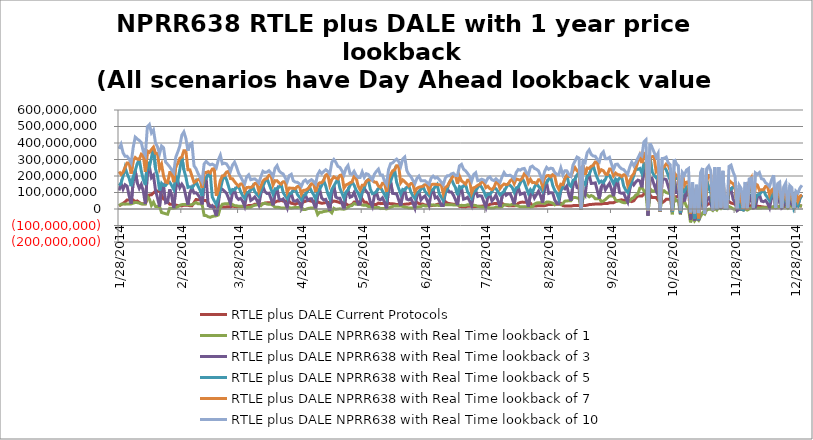
| Category | RTLE plus DALE Current Protocols | RTLE plus DALE NPRR638 with Real Time lookback of 1 | RTLE plus DALE NPRR638 with Real Time lookback of 3 | RTLE plus DALE NPRR638 with Real Time lookback of 5 | RTLE plus DALE NPRR638 with Real Time lookback of 7 | RTLE plus DALE NPRR638 with Real Time lookback of 10 |
|---|---|---|---|---|---|---|
| 1/28/14 | 18516424.113 | 20399560.426 | 112095958.616 | 142272377.272 | 226830423.44 | 364435115.637 |
| 1/29/14 | 26165652.225 | 28909144.799 | 155416252.293 | 155416252.293 | 209776525.425 | 391856557.637 |
| 1/30/14 | 33951592.112 | 30255629.968 | 120211298.967 | 198749863.235 | 223461243.791 | 340827630.768 |
| 1/31/14 | 43045783.01 | 29263774.278 | 146816658.791 | 251543005.81 | 251543005.81 | 319220078.994 |
| 2/1/14 | 54769080.035 | 30826459.922 | 138255348.886 | 213737360.818 | 279364302.681 | 319215565.212 |
| 2/2/14 | 54769080.035 | 30827968.441 | 79570255.275 | 185868729.61 | 279365654.399 | 302592761.632 |
| 2/3/14 | 54769080.035 | 30884832.851 | 30884832.851 | 138313696.677 | 213795577.059 | 279422518.809 |
| 2/4/14 | 54867904.896 | 35517006.21 | 165214299.553 | 193458300.274 | 292853142.244 | 373257685.61 |
| 2/5/14 | 44459964.79 | 39470498.834 | 232678368.051 | 232678368.051 | 312012565.709 | 435789966.993 |
| 2/6/14 | 48889341.468 | 38610057.335 | 157680296.919 | 275745232.644 | 302300052.615 | 424138458.213 |
| 2/7/14 | 39654347.796 | 35788167.659 | 124989301.759 | 300301529.113 | 300301529.113 | 415849050.923 |
| 2/8/14 | 32006154.249 | 31525750.605 | 148644249.645 | 229967872.296 | 332348260.04 | 402675690.205 |
| 2/9/14 | 32006154.249 | 30052473.463 | 108138911.42 | 177240204.925 | 325256826.954 | 347786114.363 |
| 2/10/14 | 32006154.249 | 30010066.314 | 30010066.314 | 144966008.475 | 224766518.477 | 325214419.805 |
| 2/11/14 | 63028979.82 | 76700764.711 | 221611411.153 | 283824705.48 | 351335542.64 | 498756808.259 |
| 2/12/14 | 85547610.904 | 60494095.955 | 255828584.745 | 255828584.745 | 342984214.06 | 512044208.671 |
| 2/13/14 | 85937272.747 | 22122072.307 | 190198002.969 | 310790969.787 | 360198263.116 | 461362233.501 |
| 2/14/14 | 97417042.342 | 41624599.795 | 205096050.102 | 375213213.897 | 375213213.897 | 478931855.04 |
| 2/15/14 | 109654336.546 | 15554018.819 | 113405379.327 | 244220459.746 | 337402647.488 | 400890888.955 |
| 2/16/14 | 109654336.546 | 15730046.644 | 67330196.654 | 200732422.143 | 336290164.841 | 375788939.316 |
| 2/17/14 | 109654336.546 | 15216624.189 | 15216624.189 | 112325077.424 | 242372737.804 | 334970201.166 |
| 2/18/14 | 84640835.996 | -21566277.736 | 126275726.066 | 156043260.111 | 270950090.733 | 381962236.98 |
| 2/19/14 | 60344140.354 | -24846953.971 | 142855503.401 | 142855503.401 | 199006510.714 | 370793735.507 |
| 2/20/14 | 56842811.04 | -28865713.315 | 36959656.061 | 142748386.433 | 163544165.408 | 284226804.264 |
| 2/21/14 | 42485541.507 | -31619771.792 | 40687866.115 | 159591848.004 | 159591848.004 | 270980460.73 |
| 2/22/14 | 29104966.55 | 5285201.83 | 119182273.325 | 162749827.4 | 220503997.894 | 255561639.115 |
| 2/23/14 | 29104966.55 | 5258478.618 | 78625305.436 | 141818140.221 | 220479769.18 | 236659790.027 |
| 2/24/14 | 29104966.55 | 5194667.969 | 5194667.969 | 119093465.364 | 162661798.283 | 220415958.53 |
| 2/25/14 | 23864162.506 | 7421725.703 | 124712521.729 | 195262193.233 | 255087814.132 | 313775878.883 |
| 2/26/14 | 21068769.319 | 14281252.442 | 169088114.263 | 169088114.263 | 276490635.937 | 345878901.198 |
| 2/27/14 | 19355877.946 | 22426579.864 | 129003166.061 | 238706821.862 | 307830720.012 | 382579019.585 |
| 2/28/14 | 18802534.063 | 26546401.694 | 150344897.786 | 314663844.16 | 314663844.16 | 447190654.783 |
| 3/1/14 | 23128178.094 | 27570564.314 | 130953776.934 | 238202969.225 | 353648650.807 | 467047318.339 |
| 3/2/14 | 23128178.094 | 27353331.227 | 76942359.745 | 194020500.728 | 353630624.907 | 427426977.336 |
| 3/3/14 | 23128178.094 | 27360286.777 | 27360286.777 | 130813057.374 | 238142993.436 | 353643048.647 |
| 3/4/14 | 19411967.958 | 24752961.765 | 99163431.365 | 134862197.291 | 237319805.025 | 390451392.11 |
| 3/5/14 | 19581333.766 | 27296179.854 | 128518329.272 | 128518329.272 | 198679959.438 | 399800107.88 |
| 3/6/14 | 38369816.469 | 32655651.702 | 97150487.572 | 145070150.244 | 161080137.956 | 261946828.014 |
| 3/7/14 | 57550185.653 | 38998330.31 | 98349647.378 | 169079986.621 | 169079986.621 | 244859808.595 |
| 3/8/14 | 56044264.844 | 31311869.251 | 85143202.348 | 137302429.27 | 178083187.714 | 214849075.524 |
| 3/9/14 | 56044264.844 | 31375785.518 | 67019980.06 | 114031028.373 | 178147103.981 | 191204769.557 |
| 3/10/14 | 56044264.844 | 28194421.17 | 28194421.17 | 78546573.934 | 127730186.353 | 165727343.42 |
| 3/11/14 | 50786282.858 | -38603299.401 | 161688003.813 | 185925226.319 | 220749716.952 | 272978841.364 |
| 3/12/14 | 52394012.107 | -40010102.679 | 186641318.346 | 186641318.346 | 220630272.35 | 288581287.711 |
| 3/13/14 | 35279158.185 | -47059323.929 | 21210291.885 | 205157444.541 | 227046638.859 | 275386190.136 |
| 3/14/14 | 16658128.226 | -50496691.407 | 14727990.447 | 218556217.602 | 218556217.602 | 267628556.027 |
| 3/15/14 | 13706829.115 | -45236902.647 | 20976756.156 | 73790873.645 | 241989220.377 | 272033096.495 |
| 3/16/14 | 13706829.115 | -42858848.14 | -6181524.118 | 49634938.153 | 244791957.035 | 264870208.648 |
| 3/17/14 | 13706829.115 | -41377827.735 | -41377827.735 | 26038787.558 | 79763387.511 | 249591177.904 |
| 3/18/14 | 10367868.111 | -36083955.279 | 35209461.609 | 64469423.371 | 117292990.368 | 297452494.831 |
| 3/19/14 | 12220663.599 | 8814215.317 | 117139973.304 | 117139973.304 | 172788227.596 | 326073164.546 |
| 3/20/14 | 12280244.26 | 28825247.756 | 119464012.825 | 173236216.827 | 200805949.153 | 273577515.356 |
| 3/21/14 | 11383137.771 | 31178675.474 | 107715120.013 | 202707793.599 | 202707793.599 | 277844514.912 |
| 3/22/14 | 12942133.313 | 31486913.965 | 96613368.867 | 179788811.91 | 223435346.748 | 273582224.148 |
| 3/23/14 | 12942133.313 | 32931142.76 | 66617748.202 | 139058570.437 | 228386477.183 | 254831529.613 |
| 3/24/14 | 12942133.313 | 33297882.275 | 33297882.275 | 99577972.252 | 184176012.424 | 228753216.697 |
| 3/25/14 | 17287550.961 | 27019098.062 | 95187188.243 | 118358544.928 | 183386141.979 | 265885819.02 |
| 3/26/14 | 15207576.706 | 20731678.708 | 115715879.684 | 115715879.684 | 165798670.533 | 284138168.476 |
| 3/27/14 | 14204179.027 | 19466712.249 | 71756989.156 | 129768908.284 | 150624727.153 | 255002716.449 |
| 3/28/14 | 14449424.791 | 16762579.613 | 57904940.344 | 138241155.836 | 138241155.836 | 217217098.022 |
| 3/29/14 | 14431130.416 | 16928720.949 | 64542354.672 | 105065633.362 | 151983405.088 | 195574983.95 |
| 3/30/14 | 14431130.416 | 16375521.769 | 47476738.718 | 81082644.195 | 152608404.611 | 171862245.587 |
| 3/31/14 | 14431130.416 | 16393714.844 | 16393714.844 | 64390708.987 | 105185906.574 | 152626597.685 |
| 4/1/14 | 16995874.674 | 8229864.943 | 82331726.994 | 100593736.579 | 130048387.746 | 195210144.549 |
| 4/2/14 | 21725595.053 | 10901868.095 | 101014651.712 | 101014651.712 | 131623164.16 | 207502321.668 |
| 4/3/14 | 21760578.006 | 11257107.549 | 51796726.877 | 113219309.046 | 129947290.716 | 177538614.623 |
| 4/4/14 | 22200325.638 | 18815747.692 | 60178249.301 | 137457699.171 | 137457699.171 | 180753472.529 |
| 4/5/14 | 29239053.06 | 22883433.973 | 72798411.964 | 105050869.508 | 154639293.517 | 182760642.38 |
| 4/6/14 | 29239053.06 | 25167714.016 | 53752331.659 | 89827944.234 | 157100012.723 | 172740884.09 |
| 4/7/14 | 29239053.06 | 25399282.136 | 25399282.136 | 75425715.648 | 107753933.416 | 157450844.792 |
| 4/8/14 | 29183939.861 | 19811145.351 | 91828139.239 | 108285570.381 | 138269581.289 | 195740538.599 |
| 4/9/14 | 31253222.94 | 32896921.708 | 136772876.22 | 136772876.22 | 168502134.247 | 228804522.067 |
| 4/10/14 | 35731584.745 | 35326201.861 | 105443668.028 | 166309223.849 | 180918523.99 | 221246226.888 |
| 4/11/14 | 37383103.331 | 30326233.599 | 94130749.536 | 184622068.255 | 184622068.255 | 223954387.321 |
| 4/12/14 | 37762809.86 | 28200141.994 | 95834528.567 | 153042469.156 | 204640179.139 | 232212116.41 |
| 4/13/14 | 37762809.86 | 28120921.581 | 63158200.938 | 120475550.292 | 204560958.726 | 218245683.366 |
| 4/14/14 | 37762809.86 | 22197135.174 | 22197135.174 | 88887305.055 | 145354111.202 | 196286973.059 |
| 4/15/14 | 41320322.684 | 11109363.49 | 97184440.963 | 122558726.982 | 171894155.131 | 246804504.802 |
| 4/16/14 | 47764436.788 | 10825030.574 | 121046076.019 | 121046076.019 | 171365297.371 | 263246726.911 |
| 4/17/14 | 48480241.035 | 9469986.987 | 60943235.906 | 134281648.027 | 157780871.472 | 230910895.517 |
| 4/18/14 | 52261334.29 | 6376184.691 | 54784455.271 | 150351906.019 | 150351906.019 | 218566336.945 |
| 4/19/14 | 48076803.709 | 5960283.339 | 61138720.413 | 100167288.581 | 165018617.697 | 212537661.948 |
| 4/20/14 | 48076803.709 | 6902649.97 | 37297593.058 | 79977385.927 | 165960984.328 | 188858167.563 |
| 4/21/14 | 48076803.709 | 6999524.424 | 6999524.424 | 61882944.852 | 100656529.819 | 165009417.859 |
| 4/22/14 | 45342148.746 | 8385112.379 | 76913099.898 | 93440557.477 | 126705019.651 | 202527682.467 |
| 4/23/14 | 34456654.042 | 5301228.127 | 95112883.903 | 95112883.903 | 126366379.156 | 210461630.553 |
| 4/24/14 | 32702431.172 | 7988943.516 | 51168346.394 | 111168051.871 | 125677551.303 | 171057533.711 |
| 4/25/14 | 28520085.338 | 9118878.286 | 47086018.441 | 122588273.714 | 122588273.714 | 163175599.845 |
| 4/26/14 | 34704659.752 | 9736707.172 | 54411694.63 | 88348960.78 | 135988876.635 | 161954110.021 |
| 4/27/14 | 34704659.752 | 10085582.312 | 38112515.19 | 72039422.747 | 138870940.296 | 152727137.593 |
| 4/28/14 | 34704659.752 | 9611379.932 | 9611379.932 | 55142927.77 | 89730374.782 | 138159830.194 |
| 4/29/14 | 42270405.843 | -3575001.005 | 66396867.509 | 83274868.768 | 112956121.273 | 167207113.784 |
| 4/30/14 | 46844133.068 | -3126888.078 | 85771411.802 | 85771411.802 | 114117763.621 | 175974898.246 |
| 5/1/14 | 52461928.948 | 1886900.822 | 52894469.086 | 107890372.609 | 121146385.618 | 158721396.757 |
| 5/2/14 | 50123324.586 | 4970372.35 | 61047782.043 | 134187386.191 | 134187386.191 | 170523286.842 |
| 5/3/14 | 47294111.154 | 6236129.945 | 62451658.149 | 106936173.391 | 153526711.881 | 177750504.327 |
| 5/4/14 | 47294111.154 | 6238334.367 | 36407069.787 | 87652493.008 | 153528916.303 | 165841535.847 |
| 5/5/14 | 47294111.154 | 3122166.131 | 3122166.131 | 59952712.002 | 104863470.158 | 151854179.215 |
| 5/6/14 | 43241075.89 | -33550119.086 | 80585785.265 | 102496528.93 | 148641107.49 | 208652458.318 |
| 5/7/14 | 38024569.058 | -19284536.777 | 119967008.343 | 119967008.343 | 158962532.991 | 229287834.598 |
| 5/8/14 | 34800096.191 | -19935900.169 | 66262534.982 | 142589189.357 | 159727436.196 | 214178044.31 |
| 5/9/14 | 36025740.274 | -14875699.018 | 55126161.574 | 173959395.969 | 173959395.969 | 226769027.812 |
| 5/10/14 | 39347436.698 | -13832699.011 | 58375378.204 | 139253877.613 | 205505130.441 | 238028451.104 |
| 5/11/14 | 39347436.698 | -10894130.644 | 27128898.462 | 94516582.061 | 212093355.575 | 228355596.662 |
| 5/12/14 | 39347436.698 | -10831841.643 | -10831841.643 | 62594914.09 | 145087030.109 | 212155644.577 |
| 5/13/14 | 41773531.356 | -23387488.304 | 89302477.486 | 118676610.101 | 178280341.129 | 282787260.09 |
| 5/14/14 | 48505784.744 | 4296506.785 | 139069331.83 | 139069331.83 | 194430574.218 | 300041034.514 |
| 5/15/14 | 45934095.2 | -2514503.899 | 72263137.216 | 161260383.33 | 187310522.435 | 282858358.157 |
| 5/16/14 | 43115859.464 | -50985.301 | 64823188.72 | 182478193.243 | 182478193.243 | 258174266.499 |
| 5/17/14 | 37879502.938 | 1174317.403 | 65477551.259 | 125242559.457 | 203739130.916 | 252086265.839 |
| 5/18/14 | 37879502.938 | -358004.218 | 34737466.246 | 95834541.139 | 207069561.111 | 231535290.214 |
| 5/19/14 | 37879502.938 | -1359306.428 | -1359306.428 | 64822459.99 | 126226434.758 | 207064445.456 |
| 5/20/14 | 31479478.931 | 2375964.158 | 83080581.082 | 103389962.769 | 146090453.004 | 246958040.684 |
| 5/21/14 | 21917221.765 | 10300941.563 | 115177494.523 | 115177494.523 | 151068762.523 | 263606447.049 |
| 5/22/14 | 23149774.758 | 18557131.321 | 71133799.167 | 142621212.931 | 158892201.805 | 213568036.898 |
| 5/23/14 | 27018629.19 | 21198547.247 | 76493946.985 | 164042077.46 | 164042077.46 | 210672230.975 |
| 5/24/14 | 41753703.106 | 33326519.276 | 100233579.27 | 144713289.417 | 197841718.066 | 228501413.344 |
| 5/25/14 | 41753703.106 | 28454601.415 | 65330399.425 | 114392552.815 | 189666468.599 | 204285179.123 |
| 5/26/14 | 41753703.106 | 29365823.593 | 29365823.593 | 95348645.667 | 139135429.218 | 191278442.854 |
| 5/27/14 | 45655421.223 | 29570887.22 | 29570887.22 | 66658028.908 | 115943754.169 | 191556824.608 |
| 5/28/14 | 60459345.103 | 24028221.813 | 101218700.155 | 101218700.155 | 144299819.296 | 225025311.045 |
| 5/29/14 | 40733572.672 | 22312162.621 | 125615357.812 | 125615357.812 | 144874423.756 | 192102422.478 |
| 5/30/14 | 40432535.228 | 23517213.709 | 107051941.453 | 167486034.934 | 167486034.934 | 213829909.244 |
| 5/31/14 | 27420726.578 | 14506165.955 | 93776573.469 | 177005653.568 | 177005653.568 | 209516081.661 |
| 6/1/14 | 27420726.578 | 14366699.122 | 41332729.805 | 120066938.223 | 175525574.548 | 191786064.107 |
| 6/2/14 | 27420726.578 | 14434021.6 | 14434021.6 | 93029358.243 | 175533770.18 | 175533770.18 |
| 6/3/14 | 27652186.316 | 7829639.91 | 80085886.333 | 96777303.915 | 162934975.426 | 210927208.192 |
| 6/4/14 | 27080747.919 | 8752884.309 | 103760384.44 | 103760384.44 | 161986051.824 | 228431929.673 |
| 6/5/14 | 35976375.944 | 9747646.492 | 60684956.298 | 123723333.796 | 139073557.162 | 241434750.256 |
| 6/6/14 | 32569559.521 | 2322453.468 | 55307665.764 | 131929120.528 | 131929120.528 | 205697860.497 |
| 6/7/14 | 34048554.466 | 3026764.284 | 68174601.667 | 109282604.617 | 156554772.277 | 205790188.238 |
| 6/8/14 | 34048554.466 | 3089253.565 | 41498421.998 | 88163001.947 | 156617261.558 | 169690257.743 |
| 6/9/14 | 34048554.466 | 644086.012 | 644086.012 | 63868683.722 | 103899935.68 | 149984401.722 |
| 6/10/14 | 34307735.552 | 5934600.535 | 123083011.749 | 149332514.709 | 183738163.732 | 239010848.057 |
| 6/11/14 | 31458153.385 | 10655186.435 | 165617990.775 | 165617990.775 | 208262519.036 | 274683883.773 |
| 6/12/14 | 31697789.311 | 15275274.428 | 94697447.524 | 205487085.672 | 231059208.488 | 279467681.202 |
| 6/13/14 | 29940017.488 | 19169941.729 | 93155312.518 | 236940066.886 | 236940066.886 | 292659716.585 |
| 6/14/14 | 26652265.383 | 17972516.711 | 90937423.819 | 160845757.77 | 262643083.799 | 302288377.262 |
| 6/15/14 | 26652265.383 | 17960020.305 | 55545969.635 | 124841823.475 | 262630587.393 | 287214321.016 |
| 6/16/14 | 26652265.383 | 18882325.756 | 18882325.756 | 90378441.545 | 158834177.214 | 258485771.112 |
| 6/17/14 | 26459191.366 | 15225895.861 | 93058889.795 | 118866279.477 | 176487845.518 | 303058084.171 |
| 6/18/14 | 28881956.705 | 11036138.4 | 114721169.606 | 114721169.606 | 165254780.239 | 314801552.882 |
| 6/19/14 | 30255623.928 | 10001683.054 | 59660703.252 | 130384678.712 | 153490711.544 | 232940306.797 |
| 6/20/14 | 30840644.322 | 5925209.702 | 55250196.518 | 139943351.35 | 139943351.35 | 210190129.226 |
| 6/21/14 | 35189758.46 | 5377785.762 | 63904769.082 | 103134627.809 | 153959543.139 | 196721738.829 |
| 6/22/14 | 35189758.46 | 5388554.184 | 37250273.723 | 80312588.878 | 153828980.049 | 174370008.411 |
| 6/23/14 | 35189758.46 | 5483389.653 | 5483389.653 | 63968978.88 | 103157888.682 | 153923815.518 |
| 6/24/14 | 39439469.087 | 11104699.875 | 82047884.149 | 99394277.227 | 124871513.415 | 186190284.761 |
| 6/25/14 | 32973110.16 | 13413352.489 | 103184488.879 | 103184488.879 | 132274314.001 | 198965907.64 |
| 6/26/14 | 31027085.966 | 14941919.97 | 55230332.25 | 119421129.797 | 134664575.083 | 171690620.769 |
| 6/27/14 | 29344690.16 | 21984756.793 | 70283775.332 | 137212220.5 | 137212220.5 | 171716712.536 |
| 6/28/14 | 23544131 | 18721386.233 | 79229273.644 | 106581473.187 | 147415865.355 | 171269481.629 |
| 6/29/14 | 23544131 | 18699628.895 | 51814101.484 | 93861499.003 | 147394108.018 | 160092872.852 |
| 6/30/14 | 23544131 | 20962668.26 | 20962668.26 | 81529008.437 | 108830433.768 | 149636609.264 |
| 7/1/14 | 20291486.335 | 25123630.307 | 97868517.045 | 115520995.676 | 146456462.175 | 187613255.164 |
| 7/2/14 | 22193605.985 | 24167433.823 | 116477350.963 | 116477350.963 | 150241021.758 | 199092767.262 |
| 7/3/14 | 23245175.547 | 22591768.951 | 67401532.546 | 133704914.545 | 150378846.251 | 187127462.352 |
| 7/4/14 | 28023459.45 | 22199137.599 | 73163754.891 | 148350415.518 | 148350415.518 | 192125022.214 |
| 7/5/14 | 28637179.076 | 21514944.875 | 51057962.854 | 92043266.264 | 146558987.269 | 178534230.03 |
| 7/6/14 | 28637179.076 | 21944819.187 | 21944819.187 | 72517221.255 | 146955823.493 | 163272580.975 |
| 7/7/14 | 28637179.076 | 21863495.318 | 21863495.318 | 51397083.559 | 92380233.006 | 146874499.623 |
| 7/8/14 | 44730073.562 | 25821486.022 | 97095177.329 | 97095177.329 | 130796175.497 | 187442739.226 |
| 7/9/14 | 35456377.728 | 25867308.467 | 121663592.266 | 121663592.266 | 138879521.696 | 201831092.715 |
| 7/10/14 | 32811614.724 | 25097547.031 | 102761359.866 | 161051348.439 | 161051348.439 | 202154413.239 |
| 7/11/14 | 30887361.04 | 26319939.591 | 102977986.832 | 182762907.399 | 182762907.399 | 212711688.361 |
| 7/12/14 | 28572094.228 | 24128537.513 | 84156958.777 | 153196445.495 | 202095204.02 | 216595764.877 |
| 7/13/14 | 28572094.228 | 24225692.967 | 56911872.941 | 130113593.083 | 202444431.354 | 202444431.354 |
| 7/14/14 | 28572094.228 | 23612949.838 | 23612949.838 | 84069050.744 | 153638081.825 | 202935339.685 |
| 7/15/14 | 15936132.677 | 21519012.932 | 111916048.464 | 135816107.855 | 199225114.233 | 261188160.71 |
| 7/16/14 | 14104326.105 | 22099651.535 | 127612712.815 | 127612712.815 | 170199687.526 | 270500340.491 |
| 7/17/14 | 13319048.195 | 21649961.184 | 59169634.311 | 138713853.743 | 161174504.152 | 241272998.287 |
| 7/18/14 | 12719494.979 | 21908331.854 | 63319033.115 | 150734309.576 | 150734309.576 | 231403292.491 |
| 7/19/14 | 17189810.102 | 25537093.209 | 71344833.182 | 103341544.363 | 174915148.506 | 216059764.064 |
| 7/20/14 | 17189810.102 | 25574382.717 | 49105895.938 | 86573304.859 | 175088721.336 | 197253043.36 |
| 7/21/14 | 17189810.102 | 20968867.751 | 20968867.751 | 66161396.411 | 97611684.174 | 168278459.364 |
| 7/22/14 | 14136580.808 | 22565196.605 | 88263680.124 | 105636777.32 | 128102711.438 | 208587933.89 |
| 7/23/14 | 15343458.257 | 21347856.445 | 110784552.664 | 110784552.664 | 133850019.088 | 219675432.75 |
| 7/24/14 | 15669750.178 | 16305781.085 | 75996614.66 | 130795204.671 | 143874729.51 | 171702151.629 |
| 7/25/14 | 16738140.67 | 13618039.687 | 80781386.936 | 148344080.787 | 148344080.787 | 174389544.855 |
| 7/26/14 | 17435055.202 | 11610093.991 | 77560758.291 | 130198510.229 | 163450233.482 | 180562519.861 |
| 7/27/14 | 17435055.202 | 11530293.647 | 43924034.319 | 107422167.437 | 163681663.117 | 175353976.954 |
| 7/28/14 | 17435055.202 | 10921996.127 | 10921996.127 | 77006968.821 | 129702026.387 | 163023310.77 |
| 7/29/14 | 19934047.529 | 8762318.42 | 73502171.441 | 89551501.841 | 137510679.192 | 187397190.078 |
| 7/30/14 | 28658407.342 | 6756098.016 | 88717923.035 | 88717923.035 | 122799953.84 | 194405345.13 |
| 7/31/14 | 30651584.55 | 5301867.768 | 48802541.215 | 104442956.247 | 117761926.261 | 176863258.21 |
| 8/1/14 | 32682900.11 | 6172316.029 | 63657619.538 | 129568346.493 | 129568346.493 | 172193100.626 |
| 8/2/14 | 33434043.259 | 11771975.285 | 85040667.547 | 123390990.09 | 161471260.527 | 183221569.838 |
| 8/3/14 | 33434043.259 | 11793836.313 | 50162026.954 | 104966375.346 | 161493121.555 | 172298443.554 |
| 8/4/14 | 33434043.259 | 12100165.443 | 12100165.443 | 85368857.705 | 123719180.248 | 161799450.685 |
| 8/5/14 | 34687473.314 | 13679735.413 | 74197079.4 | 96883586.082 | 141162419.825 | 194617176.098 |
| 8/6/14 | 26485753.544 | 25275342.016 | 106622808.745 | 106622808.745 | 151593564.274 | 221143154.108 |
| 8/7/14 | 23529254.53 | 25535880.499 | 83449246.543 | 129090107.254 | 147156148.331 | 202860120.247 |
| 8/8/14 | 20040978.708 | 25586145.85 | 92525155.978 | 150898366.397 | 150898366.397 | 202545596.635 |
| 8/9/14 | 19000665.71 | 23109977.922 | 93090467.421 | 142831220.666 | 170581847.58 | 204860930.833 |
| 8/10/14 | 19000665.71 | 28977075.483 | 64246189.824 | 130635062.033 | 181329964.952 | 196170433.512 |
| 8/11/14 | 19000665.71 | 28983116.518 | 28983116.518 | 101279092.391 | 152859669.399 | 181336005.987 |
| 8/12/14 | 21273019.686 | 20574606.773 | 106218256.469 | 128636816.863 | 182267811.25 | 221231649.871 |
| 8/13/14 | 35032331.561 | 17814357.822 | 132654334.111 | 132654334.111 | 178063068.777 | 239437950.637 |
| 8/14/14 | 39657464.93 | 12978238.619 | 88656510.143 | 157493501.854 | 174604746.847 | 235700202.469 |
| 8/15/14 | 41880532.165 | 13014721.682 | 93458659.041 | 186276761.944 | 186276761.944 | 243674669.195 |
| 8/16/14 | 40803351.468 | 14427022.504 | 97236951.045 | 161893779.25 | 213820056.534 | 245820554.729 |
| 8/17/14 | 40803351.468 | 13261013.408 | 53782153.434 | 127661820.49 | 207686816.263 | 221008587.509 |
| 8/18/14 | 40803351.468 | 14047492.436 | 14047492.436 | 94784816.438 | 157871922.532 | 208473057.368 |
| 8/19/14 | 35701332.087 | 12495739.242 | 88407807.263 | 117307112.843 | 180157756.9 | 253596279.294 |
| 8/20/14 | 19854256.232 | 13374847.177 | 100320260.795 | 100320260.795 | 159869070.372 | 260035562.977 |
| 8/21/14 | 17446721.223 | 29880972.463 | 66944505.195 | 132838755.398 | 160587140.163 | 246101147.686 |
| 8/22/14 | 18451911.239 | 36300589.523 | 87394760.553 | 154995822.188 | 154995822.188 | 240775095.782 |
| 8/23/14 | 19963864.957 | 38117407.462 | 108451415.15 | 136926250.697 | 177247069.268 | 231154561.108 |
| 8/24/14 | 19963864.957 | 38380236.508 | 79857724.232 | 125118477.328 | 176206825.267 | 200658851.074 |
| 8/25/14 | 19963864.957 | 38306210.754 | 38306210.754 | 107953050.202 | 136169877.039 | 176105685.947 |
| 8/26/14 | 20358836.479 | 32599271.835 | 130100391.369 | 156570152.637 | 189472208.373 | 227763625.011 |
| 8/27/14 | 23270172.216 | 42135028.896 | 158700562.65 | 158700562.65 | 201175642.097 | 252093359.869 |
| 8/28/14 | 27699277.157 | 42544768.513 | 94510705.25 | 179661543.349 | 203187049.492 | 240443478.124 |
| 8/29/14 | 26761396.342 | 39432511.641 | 99270762.423 | 195653206.633 | 195653206.633 | 247657117.583 |
| 8/30/14 | 28039537.064 | 35926264.233 | 97490830.318 | 142801032.811 | 207674821.837 | 244846253.378 |
| 8/31/14 | 28039537.064 | 25581318.621 | 55539983.33 | 112648856.985 | 199516332.22 | 221466406.885 |
| 9/1/14 | 28039537.16 | 33448047.147 | 33448047.147 | 96887060.514 | 143604388.473 | 210339907.292 |
| 9/2/14 | 29805546.02 | 32005614.357 | 32005614.357 | 62385444.106 | 120329366.76 | 208381483.728 |
| 9/3/14 | 33834025.24 | 26437208.453 | 113205056.824 | 113205056.824 | 150421817.649 | 249222930.979 |
| 9/4/14 | 20297749.21 | 32506837.598 | 132936708.054 | 132936708.054 | 148147298.52 | 207727887.12 |
| 9/5/14 | 18289222.64 | 47626628.434 | 122530550.276 | 184995479.074 | 184995479.074 | 231575820.862 |
| 9/6/14 | 17543270.52 | 48591129.829 | 139712951.114 | 203802137.994 | 203802137.994 | 231084952.698 |
| 9/7/14 | 17543270.52 | 50395901.998 | 83740773.422 | 149831366.547 | 197590376.582 | 208764397.388 |
| 9/8/14 | 17543270.52 | 50494689.575 | 50494689.575 | 136920919.182 | 197727769.643 | 197727769.643 |
| 9/9/14 | 20438135.01 | 69480346.54 | 146750827.37 | 173587770.111 | 231210742.195 | 266325557.217 |
| 9/10/14 | 20874846.85 | 70165212.9 | 179979491.455 | 179979491.455 | 251221920.929 | 289808597.637 |
| 9/11/14 | 21959932.71 | 67221333.287 | 129543909.45 | 205387590.992 | 232105326.39 | 314888396.784 |
| 9/12/14 | 21584530.54 | 65996045.208 | 123348716.54 | 227903741.117 | 227903741.117 | 308212965.172 |
| 9/13/14 | 20775752.43 | -2091701.236 | -1904927.203 | -784355.586 | -525564.251 | -430091.676 |
| 9/14/14 | 20775752.43 | 73644100.434 | 106503188.646 | 162370561.786 | 265102279.591 | 291759421.386 |
| 9/15/14 | 20775752.43 | 86150515.73 | 86150515.73 | 150252169.809 | 208382347.425 | 282031066.659 |
| 9/16/14 | 23329629.79 | 85728693.477 | 183989106.262 | 201933297.135 | 248343784.14 | 341362182.406 |
| 9/17/14 | 26588089.57 | 73823688.927 | 207836245.897 | 207836245.897 | 245698124.599 | 358297297.726 |
| 9/18/14 | 27303352.99 | 81682907.215 | 154968675.717 | 242226824.111 | 258996299.521 | 330993969.532 |
| 9/19/14 | 29173970.41 | 76059398.079 | 155629612.671 | 263697752.551 | 263697752.551 | 321162997.602 |
| 9/20/14 | 29711451.86 | 62094914.097 | 158530219.728 | 219951489.592 | 285072776.718 | 319506367.907 |
| 9/21/14 | 29711451.86 | 62564426.307 | 111503000.094 | 188120859.446 | 285548300.621 | 301324070.569 |
| 9/22/14 | 29711451.86 | 63371737.405 | 63371737.405 | 159779486.962 | 221184014.15 | 286293390.462 |
| 9/23/14 | 30462955.64 | 45534939.594 | 134317096.184 | 169248003.668 | 238271265.033 | 332368815.676 |
| 9/24/14 | 32942502.9 | 48392003.206 | 159269881.676 | 159269881.676 | 232006448.98 | 346749917.156 |
| 9/25/14 | 32749126.57 | 57452894.598 | 116687498.361 | 179424311.477 | 211835562.827 | 304518565.816 |
| 9/26/14 | 32830928.23 | 68335898.697 | 137418526.658 | 209179204.079 | 209179204.079 | 304860268.637 |
| 9/27/14 | 38007422.47 | 78879108.44 | 155311811.685 | 203382352.926 | 242064858.522 | 313249592.912 |
| 9/28/14 | 38007422.47 | 78614200.785 | 118598390.068 | 178113014.579 | 241799950.867 | 273537333.804 |
| 9/29/14 | 38007422.47 | 77978397.131 | 77978397.131 | 153454102.585 | 200877473.345 | 239148889.453 |
| 9/30/14 | 44115170.49 | 55264429.888 | 158014807.124 | 182051427.752 | 218085854.791 | 270113616.432 |
| 10/1/14 | 50636279.98 | 47556866.444 | 170758855.089 | 170758855.089 | 208861599.646 | 271902523.468 |
| 10/2/14 | 53176920.19 | 49125297.131 | 99429815.809 | 187097633.894 | 206541412.343 | 254642200.524 |
| 10/3/14 | 55609719.16 | 42252393.398 | 95017351.786 | 196374656.34 | 196374656.34 | 243385690.719 |
| 10/4/14 | 51951274.04 | 38579672.894 | 97299217.465 | 140489437.107 | 207600014.513 | 239338281.501 |
| 10/5/14 | 51951274.04 | 38331291.18 | 66594778.041 | 115968125.312 | 207351632.799 | 224420354.016 |
| 10/6/14 | 51951274.04 | 42159779.527 | 42159779.527 | 100842699.121 | 144039966.268 | 211330497.467 |
| 10/7/14 | 49003616.39 | 50053074.278 | 117779925.869 | 133057182.689 | 170695087.721 | 253455763.147 |
| 10/8/14 | 44781022.18 | 63427617.731 | 166078188.632 | 166078188.632 | 197792277.312 | 284495195.187 |
| 10/9/14 | 49819481.04 | 69028621.02 | 146349774.994 | 202697321.483 | 214039270.226 | 261833143.867 |
| 10/10/14 | 66693516.1 | 85192170.563 | 163327016.306 | 246072052.244 | 246072052.244 | 281716471.575 |
| 10/11/14 | 78328371.66 | 89585799.924 | 175373331.23 | 239872773.011 | 285248017.817 | 308312101.307 |
| 10/12/14 | 78328371.66 | 126993992.408 | 169913253.907 | 245657305.634 | 323495360.659 | 333098578.95 |
| 10/13/14 | 78328371.66 | 131789031.012 | 131789031.012 | 216081805.166 | 278344367.714 | 322006940.585 |
| 10/14/14 | 89884609.41 | 109722867.525 | 246278605.499 | 276040063.515 | 337305130.32 | 407347560.26 |
| 10/15/14 | 107590362.39 | 100135214.505 | 265528302.425 | 265528302.425 | 325107824.506 | 419355134.908 |
| 10/16/14 | 106587412.84 | -40696135.006 | -39800368.147 | -12496825.742 | -12410839.711 | -8257559.607 |
| 10/17/14 | 85130927.04 | 123738463.319 | 184862420.634 | 314262312.412 | 314262312.412 | 396872119.633 |
| 10/18/14 | 70074284.39 | 109352556.98 | 187559051.25 | 226534125.847 | 317423794.349 | 373043444.243 |
| 10/19/14 | 70074284.39 | 109773822.345 | 147738366.966 | 204320333.101 | 317845059.714 | 344586287.731 |
| 10/20/14 | 70074284.39 | 114067952.555 | 114067952.555 | 189738733.721 | 227291522.984 | 315271926.606 |
| 10/21/14 | 53144116.22 | 114460945.459 | 180887657.499 | 200195954.051 | 242795168.53 | 337898982.25 |
| 10/22/14 | 38679585.33 | -17160733.115 | -13920812.375 | -13920812.375 | -13416165.295 | -11773795.009 |
| 10/23/14 | 37833720.82 | 111258313.951 | 179980229.529 | 236176443.581 | 252692845.837 | 306115635.349 |
| 10/24/14 | 46890201.03 | 110903210.913 | 182158661.416 | 254859103.994 | 254859103.994 | 307641261.015 |
| 10/25/14 | 59496065.05 | 99477576.869 | 177974148.649 | 237112920.617 | 272831158.959 | 314470824.533 |
| 10/26/14 | 59496065.05 | 95946732.783 | 137214078.241 | 204367535.404 | 265477111.414 | 280029207.244 |
| 10/27/14 | 59496065.05 | 96141908.841 | 96141908.841 | 173842901.055 | 232403061.568 | 267643022.05 |
| 10/28/14 | 64044407.45 | -32116632.089 | -17884761.697 | -17125273.897 | -9978455.928 | -7395462.108 |
| 10/29/14 | 73130038.18 | 70765786.035 | 183143396.09 | 183143396.09 | 220812675.35 | 302073025.795 |
| 10/30/14 | 74454102.68 | 49365901.484 | 99838448.019 | 184998760.428 | 201037443.231 | 272693907.802 |
| 10/31/14 | 77399479.64 | 49598943.247 | 101783274.517 | 200574405.987 | 200574405.987 | 262193120.366 |
| 11/1/14 | 78834628.62 | -32750396.436 | -30736895.536 | -22408869.152 | -8858140.317 | -7910806.591 |
| 11/2/14 | 78834628.62 | 46927961.687 | 81142993.968 | 123233762.127 | 206194636.931 | 221469694.456 |
| 11/3/14 | 78834628.62 | 46151840.832 | 46151840.832 | 108341959.946 | 143815407.014 | 205383907.428 |
| 11/4/14 | 83504454.25 | 15926430.73 | 120762864.504 | 134747973.186 | 162738319.091 | 236077134.538 |
| 11/5/14 | 88864611.37 | 7788209.327 | 137711020.629 | 137711020.629 | 165229022.574 | 245005635.877 |
| 11/6/14 | 81914369.86 | -81318502.381 | -65620303.902 | -30282046.91 | -29104215.85 | -20344474.801 |
| 11/7/14 | 71813118.15 | -41481355.82 | 21598527.683 | 129146793.487 | 129146793.487 | 162923739.31 |
| 11/8/14 | 57776478.26 | -72081912.618 | -70387403.784 | -60160315.882 | -28001702.28 | -26383125.413 |
| 11/9/14 | 57776478.26 | -56025138.92 | -16890485.993 | 40556556.023 | 135936272.573 | 146747128.233 |
| 11/10/14 | 57776478.26 | -68634855.93 | -68634855.93 | -66940347.095 | -56713259.193 | -24554645.591 |
| 11/11/14 | 46425368.01 | -43675971.502 | 56366434.737 | 88716281.984 | 140646654.448 | 221634235.73 |
| 11/12/14 | 22696187.27 | -22804488.614 | 105010463.464 | 105010463.464 | 168486578.085 | 248572672.713 |
| 11/13/14 | 22982070.41 | -30895708.089 | -30330042.056 | -30305056.066 | -30172924.356 | -29196924.573 |
| 11/14/14 | 24374422.09 | -5686349.599 | 61782934.988 | 171602580.682 | 171602580.682 | 244847321.12 |
| 11/15/14 | 32116949.43 | -876572.863 | 69107338.766 | 125760195.546 | 203497388.223 | 260660504.628 |
| 11/16/14 | 32116949.43 | -913496.301 | 34546963.715 | 98409262.715 | 203460464.785 | 231347548.904 |
| 11/17/14 | 32116949.43 | -9325162.231 | -9325162.231 | -8336620.696 | -7861205.533 | -7837013.926 |
| 11/18/14 | 41356718.24 | 5068946.398 | 84825114.235 | 107505508.461 | 159331286.084 | 253042236.099 |
| 11/19/14 | 53598448.94 | -6377102.501 | -685822.813 | -685822.813 | 19599.016 | 488046.323 |
| 11/20/14 | 57338693.02 | 11604436.205 | 88777231.052 | 163350320.484 | 184432323.919 | 254482999.9 |
| 11/21/14 | 59629711.3 | 2191242.495 | 3304103.632 | 7653487.82 | 7653487.82 | 8512057.998 |
| 11/22/14 | 51811668.13 | 12847594.164 | 77180656.548 | 140030984.353 | 194196342.869 | 231537645.542 |
| 11/23/14 | 51811668.13 | 2456134.925 | 2915918.82 | 3998743.79 | 8305769.179 | 8536821.732 |
| 11/24/14 | 51811668.13 | 2379142.303 | 2379142.303 | 2958017.818 | 7265438.583 | 8228776.558 |
| 11/25/14 | 44718957.52 | 14531737.297 | 105001827.524 | 127941493.628 | 174068988.166 | 257695427.007 |
| 11/26/14 | 36637578.51 | 9014745.992 | 119419912.775 | 119419912.775 | 161812033.635 | 265922577.958 |
| 11/27/14 | 32763178.14 | 565288.123 | 60127144.318 | 132080741.13 | 153062690.96 | 224488046.868 |
| 11/28/14 | 29474253.96 | -704556.681 | 37510484.424 | 131992052.833 | 131992052.833 | 194700401.833 |
| 11/29/14 | 31232863.93 | -9602907.006 | -9602907.006 | 1872895.416 | 2685737.104 | 3097259.218 |
| 11/30/14 | 31232863.93 | -738180.347 | -738180.347 | 35461203.195 | 124370877.206 | 144170073.58 |
| 12/1/14 | 31232863.93 | -854150.498 | -854150.498 | -854150.498 | 55961064.996 | 124174246.517 |
| 12/2/14 | 30465102.92 | -6351962.795 | -4664656.996 | -4664656.996 | 491796.772 | 5210393.68 |
| 12/3/14 | 19890836.48 | -1111238.12 | 92386335.344 | 92386335.344 | 92386335.344 | 163915217.094 |
| 12/4/14 | 17792648.05 | -6187636.18 | -5063583.397 | -3562677.329 | -3562677.329 | 5115239.814 |
| 12/5/14 | 19891799.14 | 111729.662 | 88264654.412 | 163290054.379 | 163290054.379 | 182113453.561 |
| 12/6/14 | 20229600.13 | 7032305.028 | 51148752.214 | 129403897.773 | 187449970.56 | 187449970.56 |
| 12/7/14 | 20229600.13 | 5606886.693 | 6087104.626 | 6898397.22 | 7830106.025 | 7830106.025 |
| 12/8/14 | 20229600.13 | 9186494.967 | 9186494.967 | 60657247.052 | 152246807.113 | 219180221.495 |
| 12/9/14 | 16281555.83 | 5291854.289 | 70716112.505 | 85773482.674 | 145340271.01 | 210194688.291 |
| 12/10/14 | 15645638.84 | 6695441.691 | 87337630.646 | 87337630.646 | 113811555.016 | 220901332.603 |
| 12/11/14 | 13897471.27 | 6714372.851 | 47886975.965 | 103719094.847 | 117194319.872 | 183221497.19 |
| 12/12/14 | 11800151.71 | 7179048.488 | 44200968.347 | 116531581.774 | 116531581.774 | 180503004.23 |
| 12/13/14 | 10650307.45 | 8136370.126 | 51404338.142 | 85963745.758 | 136656958.101 | 159492918.46 |
| 12/14/14 | 10650307.45 | 8254483.297 | 34766496.493 | 69132379.802 | 137812026.226 | 150018166.53 |
| 12/15/14 | 10650307.45 | 7098701.023 | 7098701.023 | 50707606.663 | 85582293.976 | 136680449.77 |
| 12/16/14 | 11368333.1 | 10423155.179 | 67642100.484 | 86533065.727 | 114967132.155 | 177047237.456 |
| 12/17/14 | 10115992.01 | 14511815.82 | 90224866.208 | 90224866.208 | 124498104.484 | 204263684.489 |
| 12/18/14 | 11181598.8 | 6645896.329 | 6771405.568 | 7183559.169 | 7234160.779 | 7372888.679 |
| 12/19/14 | 11737127.7 | 14110202.222 | 49997936.27 | 108785166.324 | 108785166.324 | 153750520.391 |
| 12/20/14 | 12921023.44 | 17458862.172 | 65622913.07 | 95870695.589 | 133137564.231 | 163067234.582 |
| 12/21/14 | 12921023.44 | 5838497.606 | 6097232.642 | 6273661.554 | 6739890.8 | 6789360.344 |
| 12/22/14 | 12921023.44 | 17380069.796 | 17380069.796 | 66291661.031 | 96930333.911 | 134738997.463 |
| 12/23/14 | 13333802.13 | 18740947.74 | 72468439.185 | 87185015.704 | 112927156.23 | 158284077.311 |
| 12/24/14 | 17975328.01 | 5438072.867 | 6009621.359 | 6009621.359 | 6267751.953 | 6618294.157 |
| 12/25/14 | 18688327.84 | 19141766.782 | 46835343.312 | 94063373.286 | 107220134.018 | 142286910.659 |
| 12/26/14 | 19400489.11 | 17495021.913 | 32843169.77 | 92416628.416 | 92416628.416 | 129257621.609 |
| 12/27/14 | 19986631.96 | 5174271.202 | 5174271.202 | 5567467.854 | 5766279.247 | 6010993.888 |
| 12/28/14 | 19986631.96 | 18592557.15 | 18592557.15 | 34342701.44 | 95404365.623 | 108715685.617 |
| 12/29/14 | 19986631.96 | 20168956.332 | 20168956.332 | 20168956.332 | 48559014.145 | 96980764.805 |
| 12/30/14 | 20043766.97 | 18696546.68 | 65124155.206 | 65124155.206 | 78614190.721 | 127254120.982 |
| 12/31/14 | 16287426.01 | 19179512.374 | 84492440.199 | 84492440.199 | 84492440.199 | 143803277.198 |